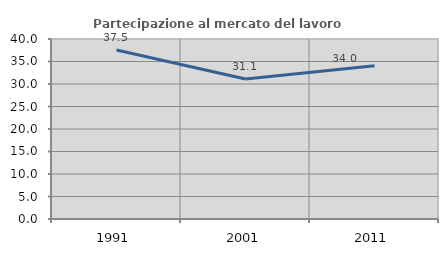
| Category | Partecipazione al mercato del lavoro  femminile |
|---|---|
| 1991.0 | 37.539 |
| 2001.0 | 31.121 |
| 2011.0 | 34.039 |